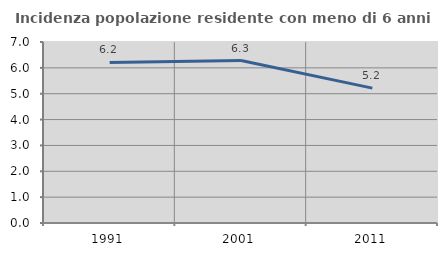
| Category | Incidenza popolazione residente con meno di 6 anni |
|---|---|
| 1991.0 | 6.21 |
| 2001.0 | 6.281 |
| 2011.0 | 5.215 |